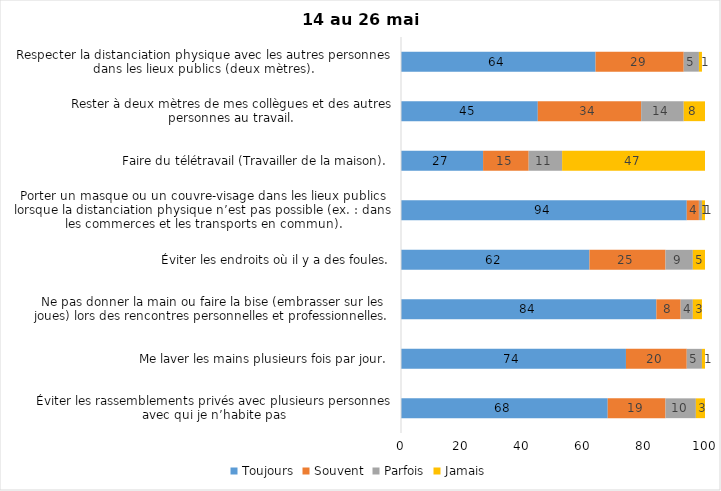
| Category | Toujours | Souvent | Parfois | Jamais |
|---|---|---|---|---|
| Éviter les rassemblements privés avec plusieurs personnes avec qui je n’habite pas | 68 | 19 | 10 | 3 |
| Me laver les mains plusieurs fois par jour. | 74 | 20 | 5 | 1 |
| Ne pas donner la main ou faire la bise (embrasser sur les joues) lors des rencontres personnelles et professionnelles. | 84 | 8 | 4 | 3 |
| Éviter les endroits où il y a des foules. | 62 | 25 | 9 | 5 |
| Porter un masque ou un couvre-visage dans les lieux publics lorsque la distanciation physique n’est pas possible (ex. : dans les commerces et les transports en commun). | 94 | 4 | 1 | 1 |
| Faire du télétravail (Travailler de la maison). | 27 | 15 | 11 | 47 |
| Rester à deux mètres de mes collègues et des autres personnes au travail. | 45 | 34 | 14 | 8 |
| Respecter la distanciation physique avec les autres personnes dans les lieux publics (deux mètres). | 64 | 29 | 5 | 1 |